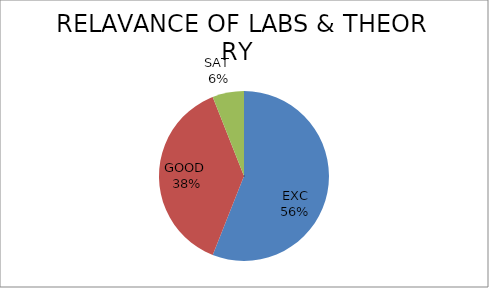
| Category | Series 0 |
|---|---|
| EXC | 56 |
| GOOD  | 38 |
| SAT  | 6 |